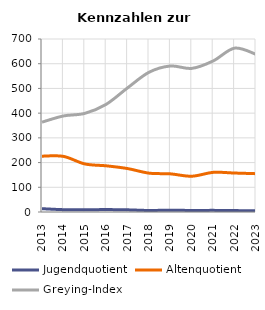
| Category | Jugendquotient | Altenquotient | Greying-Index |
|---|---|---|---|
| 2013.0 | 13.426 | 225.926 | 363.551 |
| 2014.0 | 9.417 | 225.112 | 388.571 |
| 2015.0 | 9.02 | 194.51 | 399.02 |
| 2016.0 | 9.774 | 186.842 | 435.789 |
| 2017.0 | 8.772 | 175.789 | 502.353 |
| 2018.0 | 6.154 | 157.231 | 565.385 |
| 2019.0 | 7.463 | 154.328 | 590.789 |
| 2020.0 | 6.14 | 144.74 | 581.08 |
| 2021.0 | 6.609 | 160.345 | 611.25 |
| 2022.0 | 5.76 | 157.64 | 663.01 |
| 2023.0 | 4.52 | 155.085 | 638.158 |